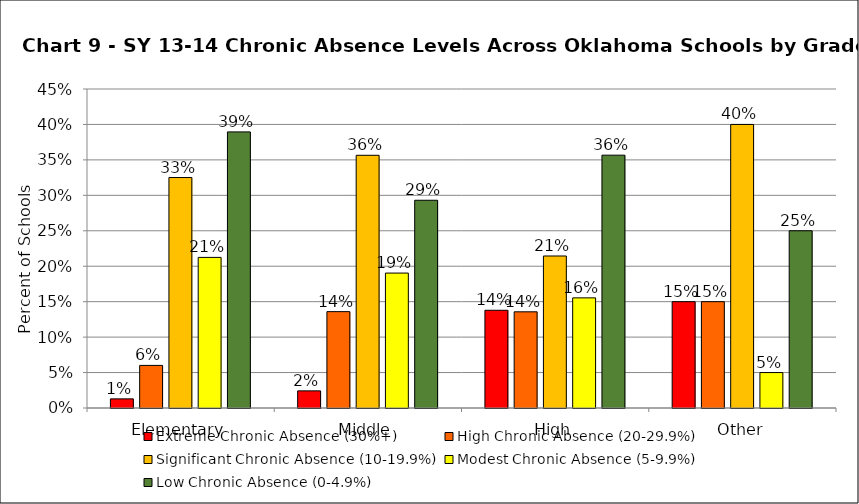
| Category | Extreme Chronic Absence (30%+) | High Chronic Absence (20-29.9%) | Significant Chronic Absence (10-19.9%) | Modest Chronic Absence (5-9.9%) | Low Chronic Absence (0-4.9%) |
|---|---|---|---|---|---|
| 0 | 0.013 | 0.06 | 0.325 | 0.212 | 0.389 |
| 1 | 0.024 | 0.136 | 0.356 | 0.19 | 0.293 |
| 2 | 0.138 | 0.136 | 0.214 | 0.155 | 0.357 |
| 3 | 0.15 | 0.15 | 0.4 | 0.05 | 0.25 |